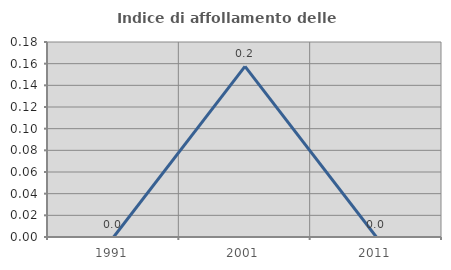
| Category | Indice di affollamento delle abitazioni  |
|---|---|
| 1991.0 | 0 |
| 2001.0 | 0.157 |
| 2011.0 | 0 |